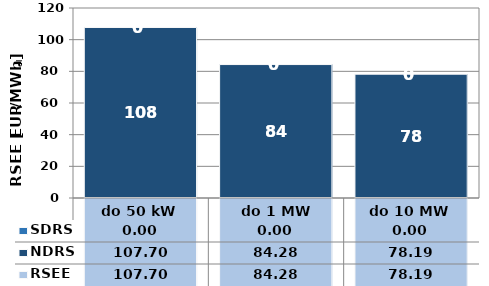
| Category | NDRS | SDRS |
|---|---|---|
| do 50 kW | 107.7 | 0 |
|  do 1 MW | 84.28 | 0 |
| do 10 MW | 78.19 | 0 |